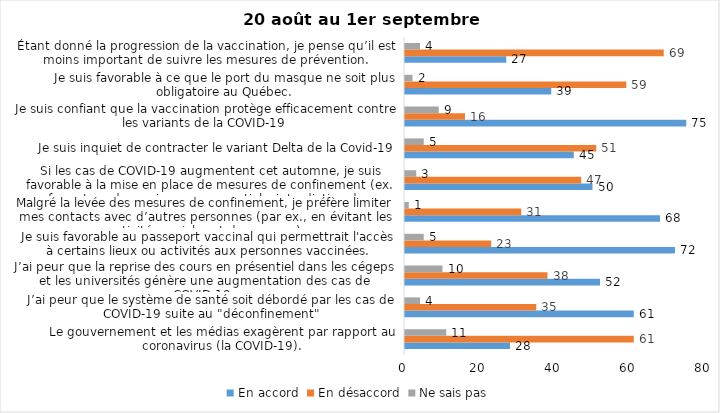
| Category | En accord | En désaccord | Ne sais pas |
|---|---|---|---|
| Le gouvernement et les médias exagèrent par rapport au coronavirus (la COVID-19). | 28 | 61 | 11 |
| J’ai peur que le système de santé soit débordé par les cas de COVID-19 suite au "déconfinement" | 61 | 35 | 4 |
| J’ai peur que la reprise des cours en présentiel dans les cégeps et les universités génère une augmentation des cas de COVID-19. | 52 | 38 | 10 |
| Je suis favorable au passeport vaccinal qui permettrait l'accès à certains lieux ou activités aux personnes vaccinées. | 72 | 23 | 5 |
| Malgré la levée des mesures de confinement, je préfère limiter mes contacts avec d’autres personnes (par ex., en évitant les activités sociales et de groupes) | 68 | 31 | 1 |
| Si les cas de COVID-19 augmentent cet automne, je suis favorable à la mise en place de mesures de confinement (ex. fermeture de services non essentiels, interdiction des rassemblements privés) | 50 | 47 | 3 |
| Je suis inquiet de contracter le variant Delta de la Covid-19 | 45 | 51 | 5 |
| Je suis confiant que la vaccination protège efficacement contre les variants de la COVID-19 | 75 | 16 | 9 |
| Je suis favorable à ce que le port du masque ne soit plus obligatoire au Québec. | 39 | 59 | 2 |
| Étant donné la progression de la vaccination, je pense qu’il est moins important de suivre les mesures de prévention. | 27 | 69 | 4 |